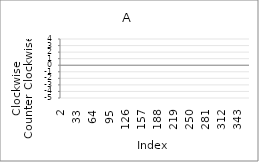
| Category | Series 0 |
|---|---|
| 2.0 | -4 |
| 3.0 | 3 |
| 4.0 | 1 |
| 5.0 | 4 |
| 6.0 | -4 |
| 7.0 | 4 |
| 8.0 | 4 |
| 9.0 | -1 |
| 10.0 | -2 |
| 11.0 | 3 |
| 12.0 | -2 |
| 13.0 | -5 |
| 14.0 | 0 |
| 15.0 | -3 |
| 16.0 | -2 |
| 17.0 | -5 |
| 18.0 | 4 |
| 19.0 | 0 |
| 20.0 | 3 |
| 21.0 | -3 |
| 22.0 | -1 |
| 23.0 | -5 |
| 24.0 | 1 |
| 25.0 | -5 |
| 26.0 | -1 |
| 27.0 | 4 |
| 28.0 | 3 |
| 29.0 | 2 |
| 30.0 | -5 |
| 31.0 | 99 |
| 32.0 | 99 |
| 33.0 | 99 |
| 34.0 | 99 |
| 35.0 | 99 |
| 36.0 | 99 |
| 37.0 | 99 |
| 38.0 | 99 |
| 39.0 | 99 |
| 40.0 | 99 |
| 41.0 | 99 |
| 42.0 | 99 |
| 43.0 | 99 |
| 44.0 | 99 |
| 45.0 | 99 |
| 46.0 | 99 |
| 47.0 | 99 |
| 48.0 | 99 |
| 49.0 | 99 |
| 50.0 | 99 |
| 51.0 | 99 |
| 52.0 | 99 |
| 53.0 | 99 |
| 54.0 | 99 |
| 55.0 | 99 |
| 56.0 | 99 |
| 57.0 | 99 |
| 58.0 | 99 |
| 59.0 | 99 |
| 60.0 | 99 |
| 61.0 | 99 |
| 62.0 | 99 |
| 63.0 | 99 |
| 64.0 | 99 |
| 65.0 | 99 |
| 66.0 | 99 |
| 67.0 | 99 |
| 68.0 | 99 |
| 69.0 | 99 |
| 70.0 | 99 |
| 71.0 | 99 |
| 72.0 | 99 |
| 73.0 | 99 |
| 74.0 | 99 |
| 75.0 | 99 |
| 76.0 | 99 |
| 77.0 | 99 |
| 78.0 | 99 |
| 79.0 | 99 |
| 80.0 | 99 |
| 81.0 | 99 |
| 82.0 | 99 |
| 83.0 | 99 |
| 84.0 | 99 |
| 85.0 | 99 |
| 86.0 | 99 |
| 87.0 | 99 |
| 88.0 | 99 |
| 89.0 | 99 |
| 90.0 | 99 |
| 91.0 | 99 |
| 92.0 | 99 |
| 93.0 | 99 |
| 94.0 | 99 |
| 95.0 | 99 |
| 96.0 | 99 |
| 97.0 | 99 |
| 98.0 | 99 |
| 99.0 | 99 |
| 100.0 | 99 |
| 101.0 | 99 |
| 102.0 | 99 |
| 103.0 | 99 |
| 104.0 | 99 |
| 105.0 | 99 |
| 106.0 | 99 |
| 107.0 | 99 |
| 108.0 | 99 |
| 109.0 | 99 |
| 110.0 | 99 |
| 111.0 | 99 |
| 112.0 | 99 |
| 113.0 | 99 |
| 114.0 | 99 |
| 115.0 | 99 |
| 116.0 | 99 |
| 117.0 | 99 |
| 118.0 | 99 |
| 119.0 | 99 |
| 120.0 | 99 |
| 121.0 | 99 |
| 122.0 | 99 |
| 123.0 | 99 |
| 124.0 | 99 |
| 125.0 | 99 |
| 126.0 | 99 |
| 127.0 | 99 |
| 128.0 | 99 |
| 129.0 | 99 |
| 130.0 | 99 |
| 131.0 | 99 |
| 132.0 | 99 |
| 133.0 | 99 |
| 134.0 | 99 |
| 135.0 | 99 |
| 136.0 | 99 |
| 137.0 | 99 |
| 138.0 | 99 |
| 139.0 | 99 |
| 140.0 | 99 |
| 141.0 | 99 |
| 142.0 | 99 |
| 143.0 | 99 |
| 144.0 | 99 |
| 145.0 | 99 |
| 146.0 | 99 |
| 147.0 | 99 |
| 148.0 | 99 |
| 149.0 | 99 |
| 150.0 | 99 |
| 151.0 | 99 |
| 152.0 | 99 |
| 153.0 | 99 |
| 154.0 | 99 |
| 155.0 | 99 |
| 156.0 | 99 |
| 157.0 | 99 |
| 158.0 | 99 |
| 159.0 | 99 |
| 160.0 | 99 |
| 161.0 | 99 |
| 162.0 | 99 |
| 163.0 | 99 |
| 164.0 | 99 |
| 165.0 | 99 |
| 166.0 | 99 |
| 167.0 | 99 |
| 168.0 | 99 |
| 169.0 | 99 |
| 170.0 | 99 |
| 171.0 | 99 |
| 172.0 | 99 |
| 173.0 | 99 |
| 174.0 | 99 |
| 175.0 | 99 |
| 176.0 | 99 |
| 177.0 | 99 |
| 178.0 | 99 |
| 179.0 | 99 |
| 180.0 | 99 |
| 181.0 | 99 |
| 182.0 | 99 |
| 183.0 | 99 |
| 184.0 | 99 |
| 185.0 | 99 |
| 186.0 | 99 |
| 187.0 | 99 |
| 188.0 | 99 |
| 189.0 | 99 |
| 190.0 | 99 |
| 191.0 | 99 |
| 192.0 | 99 |
| 193.0 | 99 |
| 194.0 | 99 |
| 195.0 | 99 |
| 196.0 | 99 |
| 197.0 | 99 |
| 198.0 | 99 |
| 199.0 | 99 |
| 200.0 | 99 |
| 201.0 | 99 |
| 202.0 | 99 |
| 203.0 | 99 |
| 204.0 | 99 |
| 205.0 | 99 |
| 206.0 | 99 |
| 207.0 | 99 |
| 208.0 | 99 |
| 209.0 | 99 |
| 210.0 | 99 |
| 211.0 | 99 |
| 212.0 | 99 |
| 213.0 | 99 |
| 214.0 | 99 |
| 215.0 | 99 |
| 216.0 | 99 |
| 217.0 | 99 |
| 218.0 | 99 |
| 219.0 | 99 |
| 220.0 | 99 |
| 221.0 | 99 |
| 222.0 | 99 |
| 223.0 | 99 |
| 224.0 | 99 |
| 225.0 | 99 |
| 226.0 | 99 |
| 227.0 | 99 |
| 228.0 | 99 |
| 229.0 | 99 |
| 230.0 | 99 |
| 231.0 | 99 |
| 232.0 | 99 |
| 233.0 | 99 |
| 234.0 | 99 |
| 235.0 | 99 |
| 236.0 | 99 |
| 237.0 | 99 |
| 238.0 | 99 |
| 239.0 | 99 |
| 240.0 | 99 |
| 241.0 | 99 |
| 242.0 | 99 |
| 243.0 | 99 |
| 244.0 | 99 |
| 245.0 | 99 |
| 246.0 | 99 |
| 247.0 | 99 |
| 248.0 | 99 |
| 249.0 | 99 |
| 250.0 | 99 |
| 251.0 | 99 |
| 252.0 | 99 |
| 253.0 | 99 |
| 254.0 | 99 |
| 255.0 | 99 |
| 256.0 | 99 |
| 257.0 | 99 |
| 258.0 | 99 |
| 259.0 | 99 |
| 260.0 | 99 |
| 261.0 | 99 |
| 262.0 | 99 |
| 263.0 | 99 |
| 264.0 | 99 |
| 265.0 | 99 |
| 266.0 | 99 |
| 267.0 | 99 |
| 268.0 | 99 |
| 269.0 | 99 |
| 270.0 | 99 |
| 271.0 | 99 |
| 272.0 | 99 |
| 273.0 | 99 |
| 274.0 | 99 |
| 275.0 | 99 |
| 276.0 | 99 |
| 277.0 | 99 |
| 278.0 | 99 |
| 279.0 | 99 |
| 280.0 | 99 |
| 281.0 | 99 |
| 282.0 | 99 |
| 283.0 | 99 |
| 284.0 | 99 |
| 285.0 | 99 |
| 286.0 | 99 |
| 287.0 | 99 |
| 288.0 | 99 |
| 289.0 | 99 |
| 290.0 | 99 |
| 291.0 | 99 |
| 292.0 | 99 |
| 293.0 | 99 |
| 294.0 | 99 |
| 295.0 | 99 |
| 296.0 | 99 |
| 297.0 | 99 |
| 298.0 | 99 |
| 299.0 | 99 |
| 300.0 | 99 |
| 301.0 | 99 |
| 302.0 | 99 |
| 303.0 | 99 |
| 304.0 | 99 |
| 305.0 | 99 |
| 306.0 | 99 |
| 307.0 | 99 |
| 308.0 | 99 |
| 309.0 | 99 |
| 310.0 | 99 |
| 311.0 | 99 |
| 312.0 | 99 |
| 313.0 | 99 |
| 314.0 | 99 |
| 315.0 | 99 |
| 316.0 | 99 |
| 317.0 | 99 |
| 318.0 | 99 |
| 319.0 | 99 |
| 320.0 | 99 |
| 321.0 | 99 |
| 322.0 | 99 |
| 323.0 | 99 |
| 324.0 | 99 |
| 325.0 | 99 |
| 326.0 | 99 |
| 327.0 | 99 |
| 328.0 | 99 |
| 329.0 | 99 |
| 330.0 | 99 |
| 331.0 | 99 |
| 332.0 | 99 |
| 333.0 | 99 |
| 334.0 | 99 |
| 335.0 | 99 |
| 336.0 | 99 |
| 337.0 | 99 |
| 338.0 | 99 |
| 339.0 | 99 |
| 340.0 | 99 |
| 341.0 | 99 |
| 342.0 | 99 |
| 343.0 | 99 |
| 344.0 | 99 |
| 345.0 | 99 |
| 346.0 | 99 |
| 347.0 | 99 |
| 348.0 | 99 |
| 349.0 | 99 |
| 350.0 | 99 |
| 351.0 | 99 |
| 352.0 | 99 |
| 353.0 | 99 |
| 354.0 | 99 |
| 355.0 | 99 |
| 356.0 | 99 |
| 357.0 | 99 |
| 358.0 | 99 |
| 359.0 | 99 |
| 360.0 | 99 |
| 361.0 | 99 |
| 362.0 | 99 |
| 363.0 | 99 |
| 364.0 | 99 |
| 365.0 | 99 |